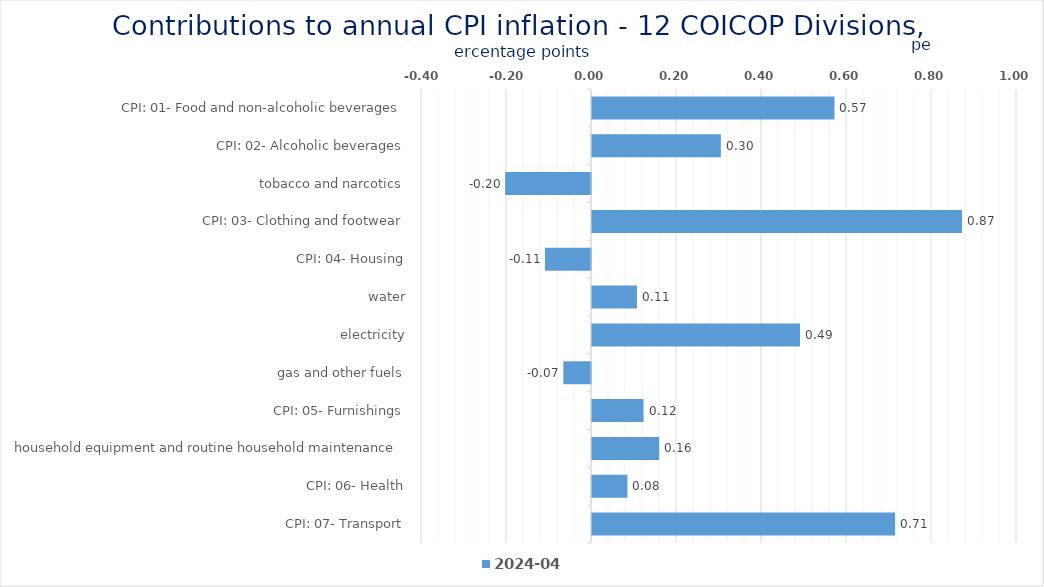
| Category | 2024-04 |
|---|---|
| CPI: 01- Food and non-alcoholic beverages | 0.571 |
| CPI: 02- Alcoholic beverages, tobacco and narcotics | 0.303 |
| CPI: 03- Clothing and footwear | -0.202 |
| CPI: 04- Housing, water, electricity, gas and other fuels | 0.871 |
| CPI: 05- Furnishings, household equipment and routine household maintenance | -0.108 |
| CPI: 06- Health | 0.106 |
| CPI: 07- Transport | 0.489 |
| CPI: 08- Communication | -0.065 |
| CPI: 09- Recreation and culture | 0.121 |
| CPI: 10- Education | 0.158 |
| CPI: 11- Restaurants and hotels | 0.083 |
| CPI: 12- Miscellaneous goods and services | 0.713 |